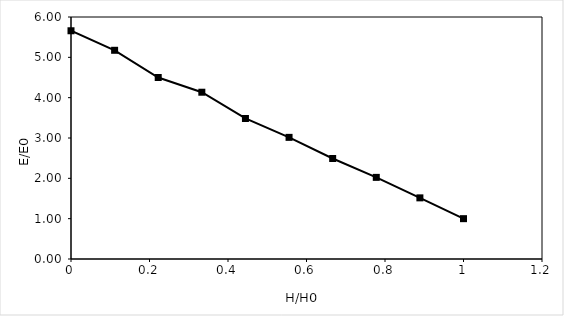
| Category | Head (feet) |
|---|---|
| 1.0 | 1 |
| 0.8888878869852718 | 1.516 |
| 0.7777757739705434 | 2.024 |
| 0.6666636609558152 | 2.492 |
| 0.555551547941087 | 3.016 |
| 0.4444394349263587 | 3.484 |
| 0.33332732191163045 | 4.135 |
| 0.22221520889690216 | 4.5 |
| 0.11110309588217389 | 5.175 |
| 0.0 | 5.659 |